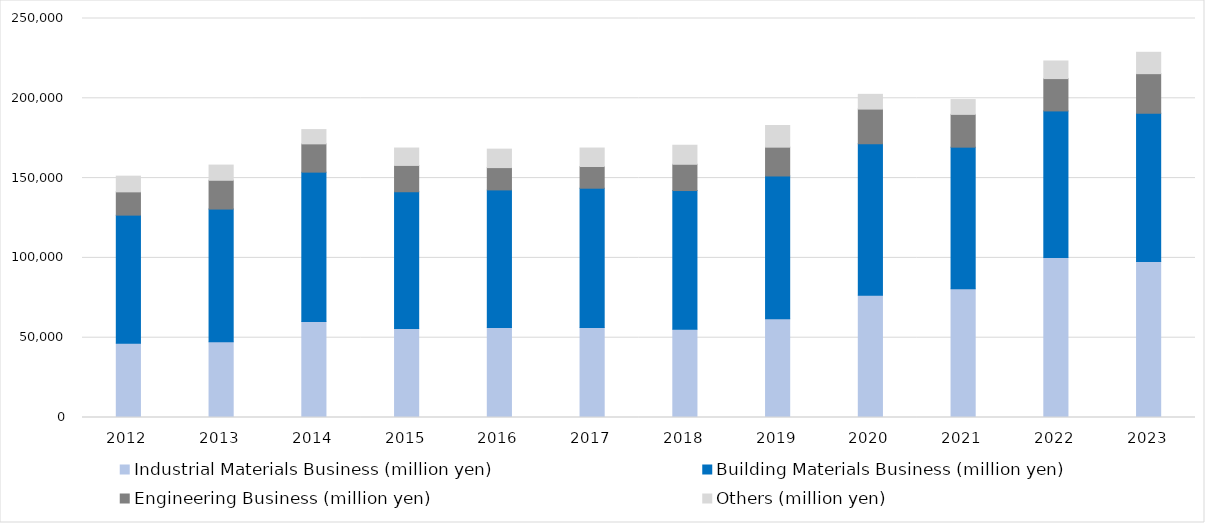
| Category | Industrial Materials Business (million yen) | Building Materials Business (million yen) | Engineering Business (million yen) | Others (million yen) |
|---|---|---|---|---|
| 2012 | 46544 | 80257 | 14580 | 9827 |
| 2013 | 47402 | 83192 | 18049 | 9508 |
| 2014 | 60184 | 93552 | 17714 | 8942 |
| 2015 | 55699 | 85753 | 16486 | 10895 |
| 2016 | 56345 | 86256 | 13978 | 11561 |
| 2017 | 56408 | 87260 | 13612 | 11560 |
| 2018 | 55354 | 86853 | 16458 | 11915 |
| 2019 | 61843 | 89485 | 18063 | 13569 |
| 2020 | 76589 | 94938 | 21713 | 9240 |
| 2021 | 80692 | 88697 | 20542 | 9277 |
| 2022 | 100177 | 91907 | 20264 | 11028 |
| 2023 | 97681 | 93000 | 24756 | 13387 |